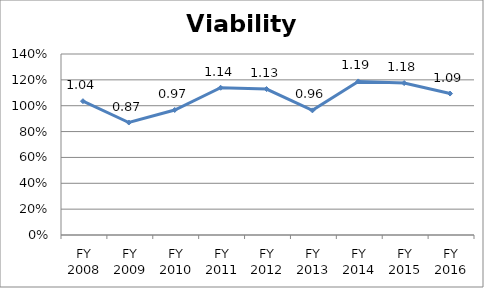
| Category | Viability ratio |
|---|---|
| FY 2016 | 1.094 |
| FY 2015 | 1.175 |
| FY 2014 | 1.188 |
| FY 2013 | 0.964 |
| FY 2012 | 1.129 |
| FY 2011 | 1.139 |
| FY 2010 | 0.967 |
| FY 2009 | 0.87 |
| FY 2008 | 1.035 |